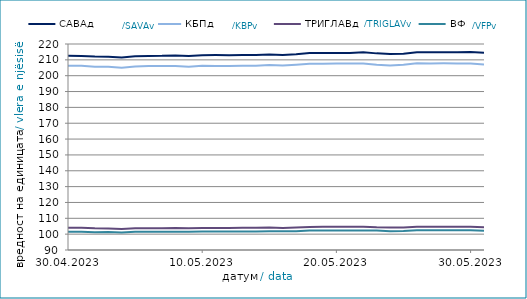
| Category | САВАд | КБПд | ТРИГЛАВд | ВФПд |
|---|---|---|---|---|
| 2023-04-30 | 212.585 | 206.291 | 104.012 | 101.472 |
| 2023-05-01 | 212.42 | 206.247 | 103.995 | 101.478 |
| 2023-05-02 | 212.035 | 205.628 | 103.687 | 101.257 |
| 2023-05-03 | 211.93 | 205.578 | 103.597 | 101.406 |
| 2023-05-04 | 211.506 | 204.965 | 103.263 | 101.1 |
| 2023-05-05 | 212.236 | 205.768 | 103.651 | 101.447 |
| 2023-05-06 | 212.5 | 206.066 | 103.796 | 101.491 |
| 2023-05-07 | 212.507 | 206.073 | 103.8 | 101.498 |
| 2023-05-08 | 212.788 | 206.127 | 103.837 | 101.562 |
| 2023-05-09 | 212.445 | 205.69 | 103.663 | 101.55 |
| 2023-05-10 | 212.963 | 206.249 | 103.926 | 101.596 |
| 2023-05-11 | 212.98 | 206.131 | 103.875 | 101.632 |
| 2023-05-12 | 212.92 | 206.112 | 103.878 | 101.693 |
| 2023-05-13 | 213.107 | 206.317 | 103.976 | 101.729 |
| 2023-05-14 | 213.114 | 206.324 | 103.981 | 101.736 |
| 2023-05-15 | 213.311 | 206.673 | 104.138 | 101.802 |
| 2023-05-16 | 213.108 | 206.368 | 103.951 | 101.809 |
| 2023-05-17 | 213.582 | 206.863 | 104.224 | 101.842 |
| 2023-05-18 | 214.26 | 207.467 | 104.538 | 102.244 |
| 2023-05-19 | 214.261 | 207.606 | 104.61 | 102.277 |
| 2023-05-20 | 214.292 | 207.641 | 104.628 | 102.288 |
| 2023-05-21 | 214.303 | 207.648 | 104.633 | 102.294 |
| 2023-05-22 | 214.806 | 207.726 | 104.661 | 102.372 |
| 2023-05-23 | 214.086 | 206.863 | 104.303 | 102.252 |
| 2023-05-24 | 213.743 | 206.477 | 104.148 | 101.852 |
| 2023-05-25 | 213.776 | 206.836 | 104.234 | 101.945 |
| 2023-05-26 | 214.822 | 207.849 | 104.702 | 102.412 |
| 2023-05-27 | 214.755 | 207.768 | 104.665 | 102.403 |
| 2023-05-28 | 214.767 | 207.776 | 104.671 | 102.409 |
| 2023-05-29 | 214.762 | 207.772 | 104.696 | 102.479 |
| 2023-05-30 | 214.923 | 207.718 | 104.703 | 102.456 |
| 2023-05-31 | 214.516 | 207.119 | 104.433 | 102.208 |